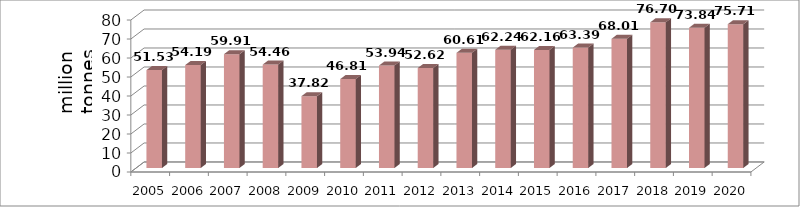
| Category | Series 1 |
|---|---|
| 2005.0 | 51.53 |
| 2006.0 | 54.19 |
| 2007.0 | 59.91 |
| 2008.0 | 54.46 |
| 2009.0 | 37.82 |
| 2010.0 | 46.81 |
| 2011.0 | 53.94 |
| 2012.0 | 52.62 |
| 2013.0 | 60.61 |
| 2014.0 | 62.24 |
| 2015.0 | 62.16 |
| 2016.0 | 63.388 |
| 2017.0 | 68.01 |
| 2018.0 | 76.7 |
| 2019.0 | 73.835 |
| 2020.0 | 75.71 |